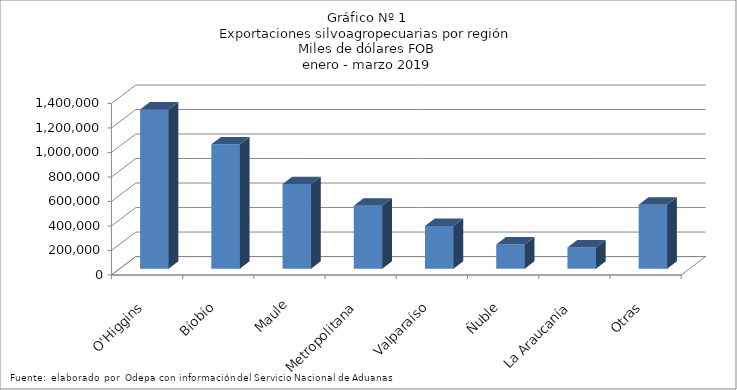
| Category | Series 0 |
|---|---|
| O'Higgins | 1299597.42 |
| Bíobío | 1015209.229 |
| Maule | 690115.577 |
| Metropolitana | 513913.175 |
| Valparaíso | 348998.575 |
| Ñuble | 197854.209 |
| La Araucanía | 173666.621 |
| Otras | 522119.106 |